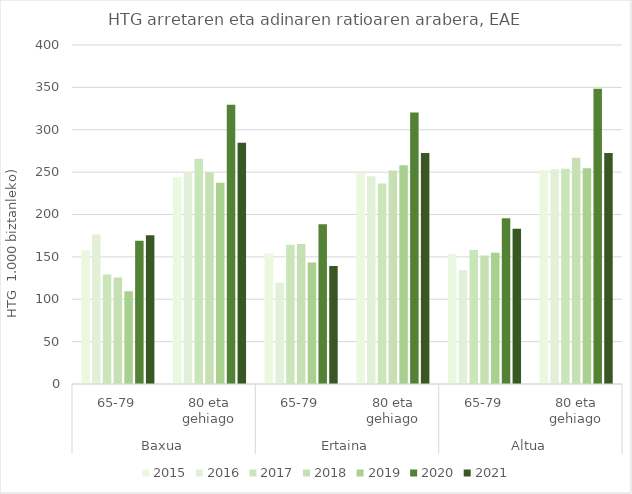
| Category | 2015 | 2016 | 2017 | 2018 | 2019 | 2020 | 2021 |
|---|---|---|---|---|---|---|---|
| 0 | 157.718 | 176.471 | 129.338 | 125.749 | 109.494 | 168.975 | 175.513 |
| 1 | 243.976 | 249.444 | 265.862 | 249.922 | 237.532 | 329.628 | 284.694 |
| 2 | 153.846 | 119.512 | 164.17 | 165.289 | 143.273 | 188.414 | 139.224 |
| 3 | 248.867 | 245.133 | 236.682 | 251.885 | 258.167 | 320.261 | 272.551 |
| 4 | 153.535 | 134.395 | 158.069 | 151.724 | 154.955 | 195.704 | 183.124 |
| 5 | 252.549 | 253.483 | 254.11 | 266.983 | 254.498 | 348.487 | 272.525 |